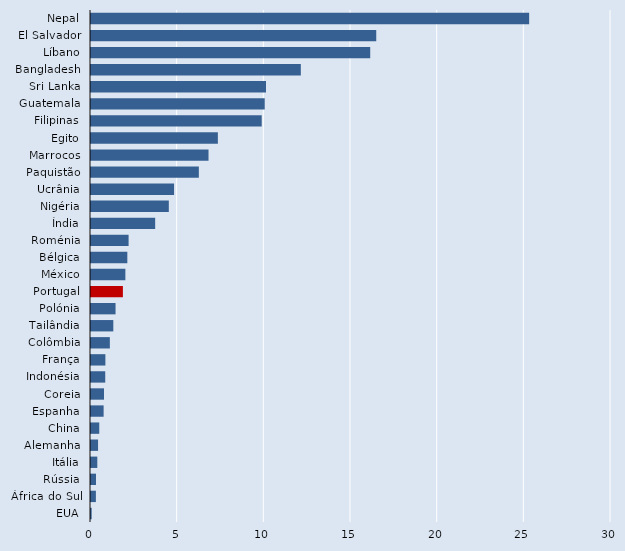
| Category | Series 2 |
|---|---|
| Nepal | 25.278 |
| El Salvador | 16.457 |
| Líbano | 16.109 |
| Bangladesh | 12.105 |
| Sri Lanka | 10.096 |
| Guatemala | 10.022 |
| Filipinas | 9.849 |
| Egito | 7.319 |
| Marrocos | 6.78 |
| Paquistão | 6.221 |
| Ucrânia | 4.792 |
| Nigéria | 4.489 |
| Índia | 3.703 |
| Roménia | 2.169 |
| Bélgica | 2.096 |
| México | 1.983 |
| Portugal | 1.84 |
| Polónia | 1.416 |
| Tailândia | 1.288 |
| Colômbia | 1.087 |
| França | 0.83 |
| Indonésia | 0.821 |
| Coreia | 0.75 |
| Espanha | 0.729 |
| China | 0.477 |
| Alemanha | 0.408 |
| Itália | 0.364 |
| Rússia | 0.287 |
| África do Sul | 0.282 |
| EUA | 0.039 |